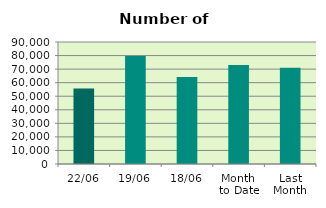
| Category | Series 0 |
|---|---|
| 22/06 | 55652 |
| 19/06 | 79732 |
| 18/06 | 64186 |
| Month 
to Date | 73053.5 |
| Last
Month | 71072.3 |